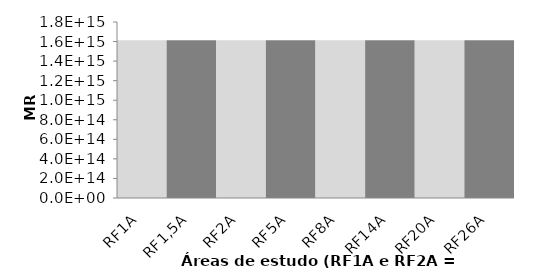
| Category | Series 0 |
|---|---|
| RF1A | 1612220539828834.8 |
| RF1,5A | 1612220539828834.8 |
| RF2A | 1612220539828834.8 |
| RF5A | 1612220539828834.8 |
| RF8A | 1612220539828834.8 |
| RF14A | 1612220539828834.8 |
| RF20A | 1612220539828834.8 |
| RF26A | 1612220539828834.8 |